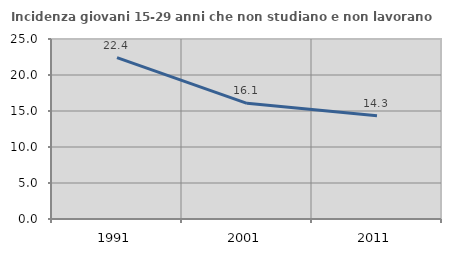
| Category | Incidenza giovani 15-29 anni che non studiano e non lavorano  |
|---|---|
| 1991.0 | 22.424 |
| 2001.0 | 16.068 |
| 2011.0 | 14.326 |